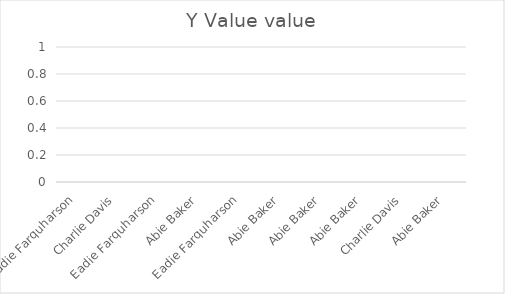
| Category | Y Value value |
|---|---|
| Eadie Farquharson | 15 |
| Charlie Davis | 11 |
| Eadie Farquharson | 11 |
| Abie Baker | 20 |
| Eadie Farquharson | 11 |
| Abie Baker | 18 |
| Abie Baker | 14 |
| Abie Baker | 10 |
| Charlie Davis | 13 |
| Abie Baker | 12 |